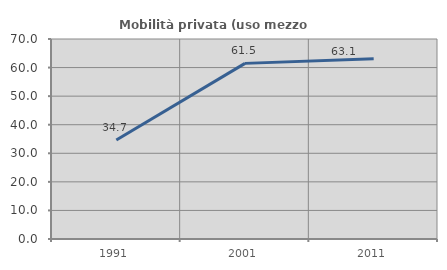
| Category | Mobilità privata (uso mezzo privato) |
|---|---|
| 1991.0 | 34.673 |
| 2001.0 | 61.469 |
| 2011.0 | 63.115 |